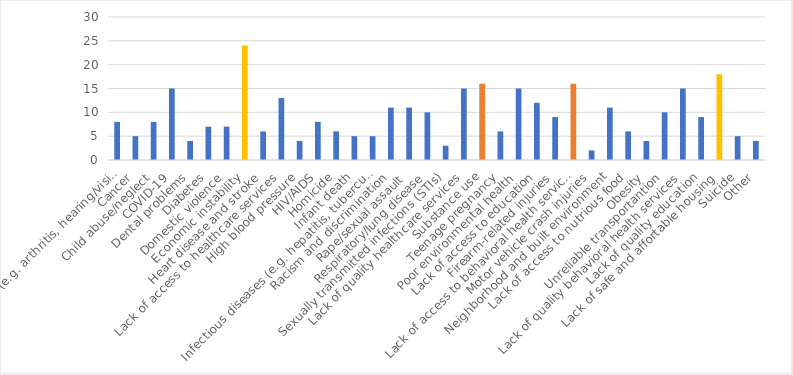
| Category | Number of Responses |
|---|---|
| Aging problems (e.g. arthritis, hearing/vision loss, etc.) | 8 |
| Cancer | 5 |
| Child abuse/neglect | 8 |
| COVID-19 | 15 |
| Dental problems | 4 |
| Diabetes | 7 |
| Domestic violence | 7 |
| Economic instability | 24 |
| Heart disease and stroke | 6 |
| Lack of access to healthcare services | 13 |
| High blood pressure | 4 |
| HIV/AIDS | 8 |
| Homicide | 6 |
| Infant death | 5 |
| Infectious diseases (e.g. hepatitis, tuberculosis, etc.) | 5 |
| Racism and discrimination | 11 |
| Rape/sexual assault | 11 |
| Respiratory/lung disease | 10 |
| Sexually transmitted infections (STIs) | 3 |
| Lack of quality healthcare services | 15 |
| Substance use | 16 |
| Teenage pregnancy | 6 |
| Poor environmental health | 15 |
| Lack of access to education | 12 |
| Firearm-related injuries | 9 |
| Lack of access to behavioral health services | 16 |
| Motor vehicle crash injuries | 2 |
| Neighborhood and built environment | 11 |
| Lack of access to nutrious food | 6 |
| Obesity | 4 |
| Unreliable transportantion | 10 |
| Lack of quality behavioral health services | 15 |
| Lack of quality education | 9 |
| Lack of safe and affortable housing | 18 |
| Suicide | 5 |
| Other | 4 |